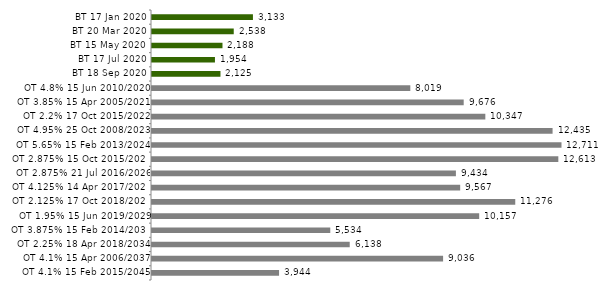
| Category | Series 0 |
|---|---|
| BT 17 Jan 2020 | 3133.367 |
| BT 20 Mar 2020 | 2537.535 |
| BT 15 May 2020 | 2187.976 |
| BT 17 Jul 2020 | 1954.16 |
| BT 18 Sep 2020 | 2125.188 |
| OT 4.8% 15 Jun 2010/2020 | 8018.658 |
| OT 3.85% 15 Apr 2005/2021 | 9675.958 |
| OT 2.2% 17 Oct 2015/2022 | 10347.462 |
| OT 4.95% 25 Oct 2008/2023 | 12434.734 |
| OT 5.65% 15 Feb 2013/2024 | 12711.355 |
| OT 2.875% 15 Oct 2015/2025 | 12613.263 |
| OT 2.875% 21 Jul 2016/2026 | 9433.982 |
| OT 4.125% 14 Apr 2017/2027 | 9566.841 |
| OT 2.125% 17 Oct 2018/2028 | 11276.387 |
| OT 1.95% 15 Jun 2019/2029 | 10156.52 |
| OT 3.875% 15 Feb 2014/2030 | 5533.902 |
| OT 2.25% 18 Apr 2018/2034 | 6137.845 |
| OT 4.1% 15 Apr 2006/2037 | 9036.174 |
| OT 4.1% 15 Feb 2015/2045 | 3944.316 |